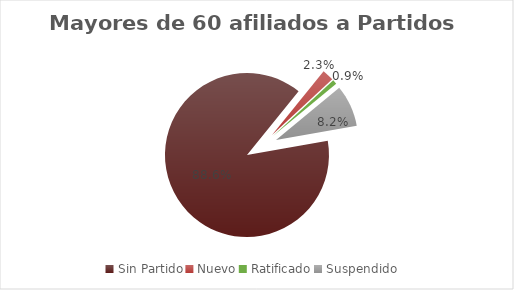
| Category | Series 0 |
|---|---|
| Sin Partido | 0.886 |
| Nuevo | 0.023 |
| Ratificado | 0.009 |
| Suspendido | 0.082 |